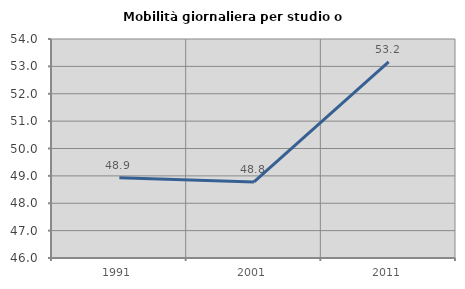
| Category | Mobilità giornaliera per studio o lavoro |
|---|---|
| 1991.0 | 48.932 |
| 2001.0 | 48.78 |
| 2011.0 | 53.168 |